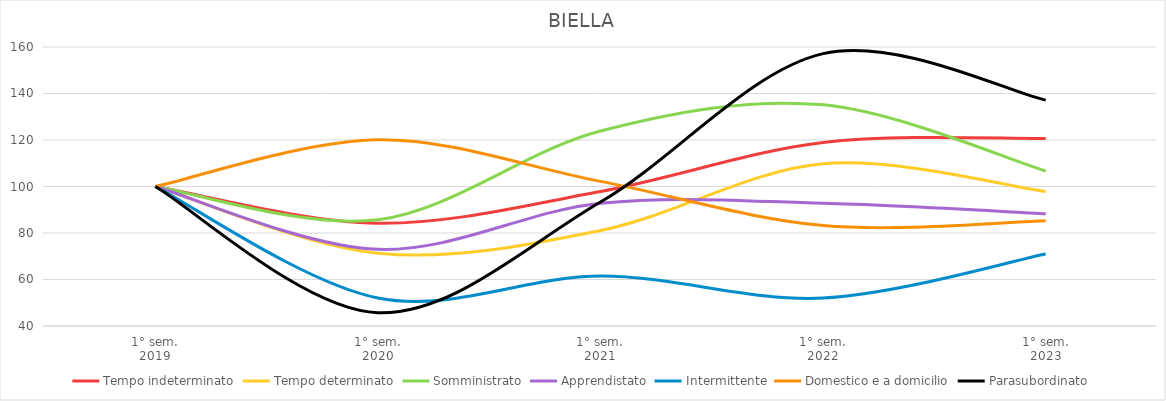
| Category | Tempo indeterminato | Tempo determinato | Somministrato | Apprendistato | Intermittente | Domestico e a domicilio | Parasubordinato |
|---|---|---|---|---|---|---|---|
| 1° sem.
2019 | 100 | 100 | 100 | 100 | 100 | 100 | 100 |
| 1° sem.
2020 | 84.211 | 71.297 | 85.687 | 72.973 | 52.027 | 120.111 | 45.714 |
| 1° sem.
2021 | 97.856 | 81.08 | 123.855 | 92.793 | 61.486 | 102.214 | 93.333 |
| 1° sem.
2022 | 118.908 | 109.783 | 135.115 | 92.793 | 52.027 | 83.21 | 157.143 |
| 1° sem.
2023 | 120.663 | 97.831 | 106.679 | 88.288 | 70.946 | 85.24 | 137.143 |